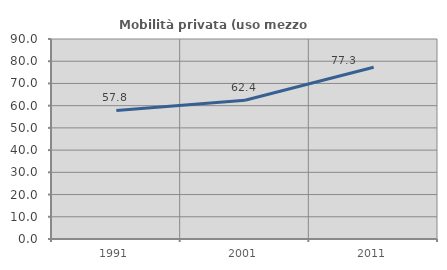
| Category | Mobilità privata (uso mezzo privato) |
|---|---|
| 1991.0 | 57.826 |
| 2001.0 | 62.448 |
| 2011.0 | 77.26 |